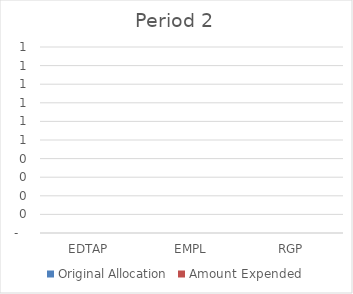
| Category | Original Allocation | Amount Expended |
|---|---|---|
| EDTAP | 0 | 0 |
| EMPL | 0 | 0 |
| RGP | 0 | 0 |